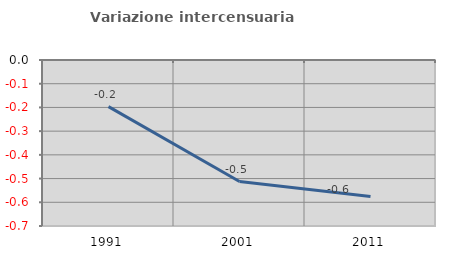
| Category | Variazione intercensuaria annua |
|---|---|
| 1991.0 | -0.197 |
| 2001.0 | -0.512 |
| 2011.0 | -0.575 |